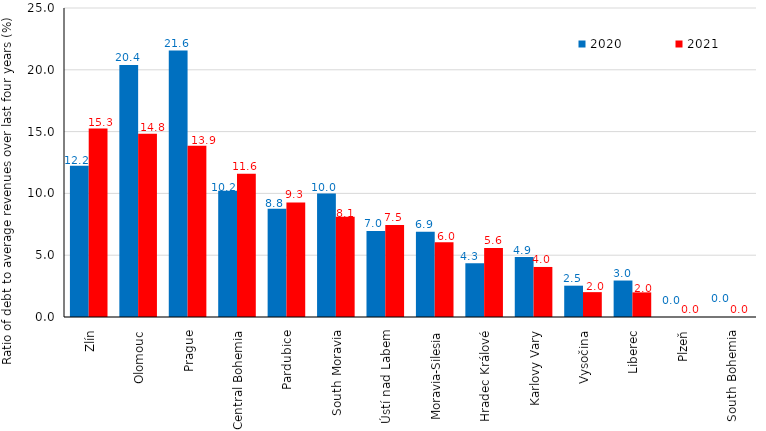
| Category | 2020 | 2021 |
|---|---|---|
| Zlín | 12.245 | 15.254 |
| Olomouc | 20.395 | 14.827 |
| Prague | 21.559 | 13.853 |
| Central Bohemia | 10.208 | 11.594 |
| Pardubice | 8.761 | 9.273 |
| South Moravia | 9.983 | 8.114 |
| Ústí nad Labem | 6.96 | 7.453 |
| Moravia-Silesia | 6.907 | 6.044 |
| Hradec Králové | 4.346 | 5.582 |
| Karlovy Vary | 4.856 | 4.049 |
| Vysočina | 2.534 | 2.011 |
| Liberec | 2.95 | 1.991 |
| Plzeň | 0 | 0 |
| South Bohemia | 0 | 0 |